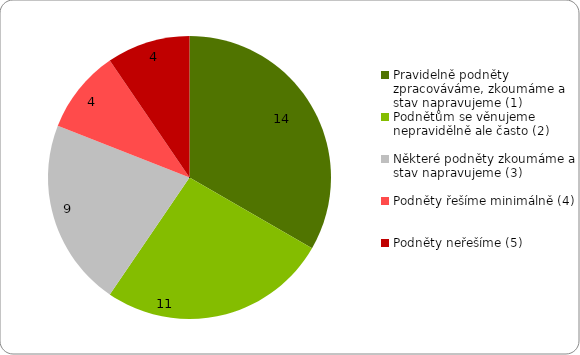
| Category | Series 0 |
|---|---|
| Pravidelně podněty zpracováváme, zkoumáme a stav napravujeme (1) | 14 |
| Podnětům se věnujeme nepravidělně ale často (2) | 11 |
| Některé podněty zkoumáme a stav napravujeme (3) | 9 |
| Podněty řešíme minimálně (4) | 4 |
| Podněty neřešíme (5) | 4 |